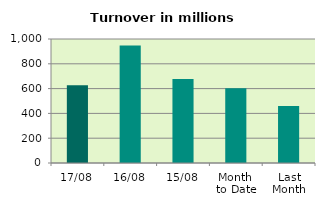
| Category | Series 0 |
|---|---|
| 17/08 | 626.561 |
| 16/08 | 948.281 |
| 15/08 | 676.861 |
| Month 
to Date | 602.564 |
| Last
Month | 458.733 |